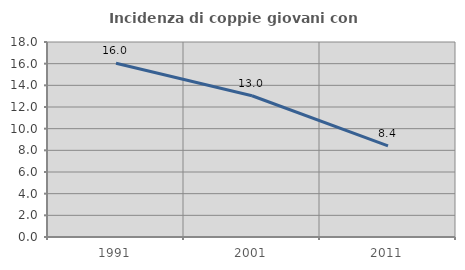
| Category | Incidenza di coppie giovani con figli |
|---|---|
| 1991.0 | 16.031 |
| 2001.0 | 13.039 |
| 2011.0 | 8.417 |